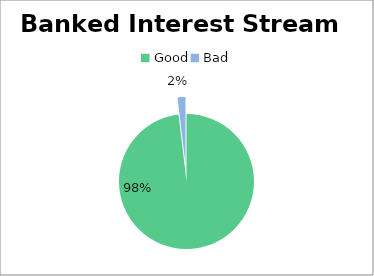
| Category | Series 0 |
|---|---|
| Good | 0.981 |
| Bad | 0.019 |